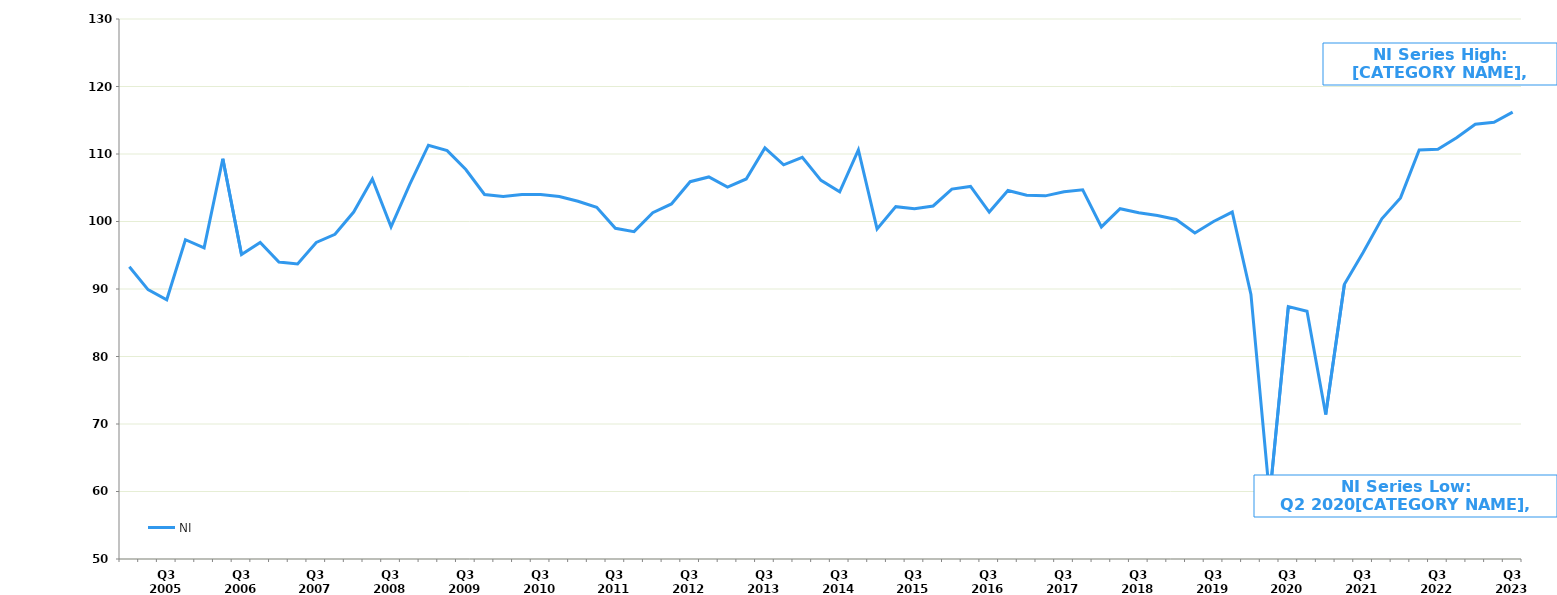
| Category | NI |
|---|---|
|  | 93.3 |
|  | 89.9 |
| Q3 2005 | 88.4 |
|  | 97.3 |
|  | 96.1 |
|  | 109.3 |
| Q3 2006 | 95.1 |
|  | 96.9 |
|  | 94 |
|  | 93.7 |
| Q3 2007 | 96.9 |
|  | 98.1 |
|  | 101.4 |
|  | 106.3 |
| Q3 2008 | 99.2 |
|  | 105.5 |
|  | 111.3 |
|  | 110.5 |
| Q3 2009 | 107.7 |
|  | 104 |
|  | 103.7 |
|  | 104 |
| Q3 2010 | 104 |
|  | 103.7 |
|  | 103 |
|  | 102.1 |
| Q3 2011 | 99 |
|  | 98.5 |
|  | 101.3 |
|  | 102.6 |
| Q3 2012 | 105.9 |
|  | 106.6 |
|  | 105.1 |
|  | 106.3 |
| Q3 2013 | 110.9 |
|  | 108.4 |
|  | 109.5 |
|  | 106.1 |
| Q3 2014 | 104.4 |
|  | 110.6 |
|  | 98.9 |
|  | 102.2 |
| Q3 2015 | 101.9 |
|  | 102.3 |
|  | 104.8 |
|  | 105.2 |
| Q3 2016 | 101.4 |
|  | 104.6 |
|  | 103.9 |
|  | 103.8 |
| Q3 2017 | 104.4 |
|  | 104.7 |
|  | 99.2 |
|  | 101.9 |
| Q3 2018 | 101.3 |
|  | 100.9 |
|  | 100.3 |
|  | 98.3 |
| Q3 2019 | 100 |
|  | 101.4 |
|  | 89.2 |
|  | 59.2 |
| Q3 2020 | 87.4 |
|  | 86.7 |
|  | 71.4 |
|  | 90.7 |
| Q3 2021 | 95.4 |
|  | 100.4 |
|  | 103.5 |
|  | 110.6 |
| Q3 2022 | 110.7 |
|  | 112.4 |
|  | 114.4 |
|  | 114.7 |
| Q3 2023 | 116.2 |